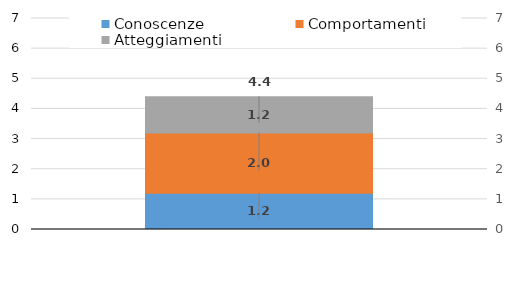
| Category | Conoscenze | Comportamenti | Atteggiamenti |
|---|---|---|---|
|  | 1.2 | 2 | 1.2 |